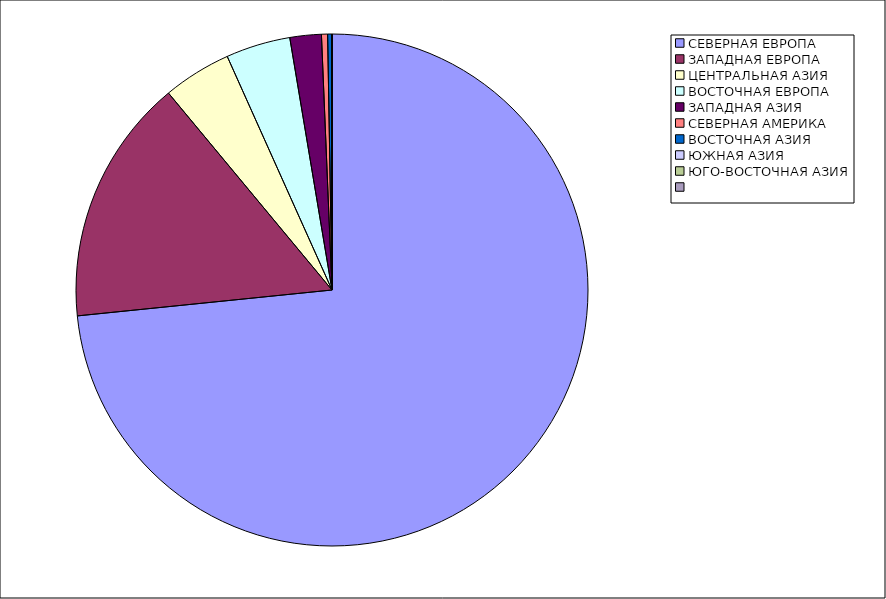
| Category | Оборот |
|---|---|
| СЕВЕРНАЯ ЕВРОПА | 73.386 |
| ЗАПАДНАЯ ЕВРОПА | 15.583 |
| ЦЕНТРАЛЬНАЯ АЗИЯ | 4.319 |
| ВОСТОЧНАЯ ЕВРОПА | 4.071 |
| ЗАПАДНАЯ АЗИЯ | 1.981 |
| СЕВЕРНАЯ АМЕРИКА | 0.386 |
| ВОСТОЧНАЯ АЗИЯ | 0.273 |
| ЮЖНАЯ АЗИЯ | 0 |
| ЮГО-ВОСТОЧНАЯ АЗИЯ | 0 |